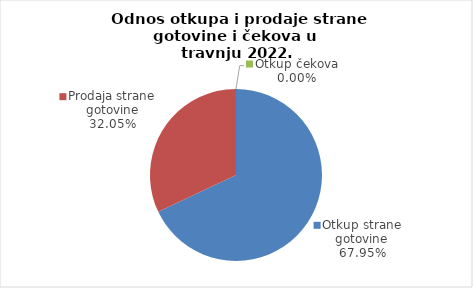
| Category | Series 0 |
|---|---|
| Otkup strane gotovine | 67.948 |
| Prodaja strane gotovine | 32.052 |
| Otkup čekova | 0 |